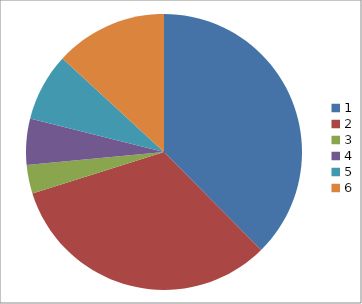
| Category | Series 0 |
|---|---|
| 0 | 180 |
| 1 | 156 |
| 2 | 16 |
| 3 | 26 |
| 4 | 38 |
| 5 | 63 |